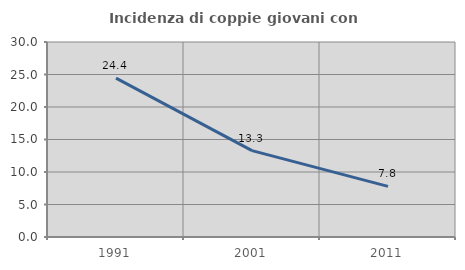
| Category | Incidenza di coppie giovani con figli |
|---|---|
| 1991.0 | 24.448 |
| 2001.0 | 13.293 |
| 2011.0 | 7.793 |